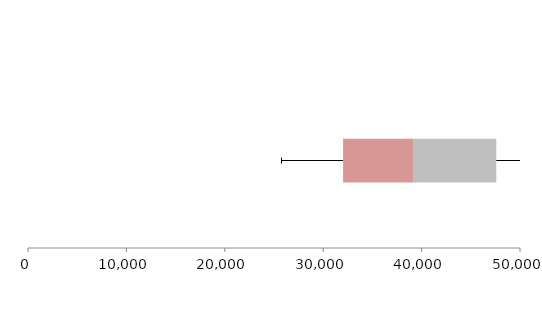
| Category | Series 1 | Series 2 | Series 3 |
|---|---|---|---|
| 0 | 32021.29 | 7101.885 | 8468.823 |